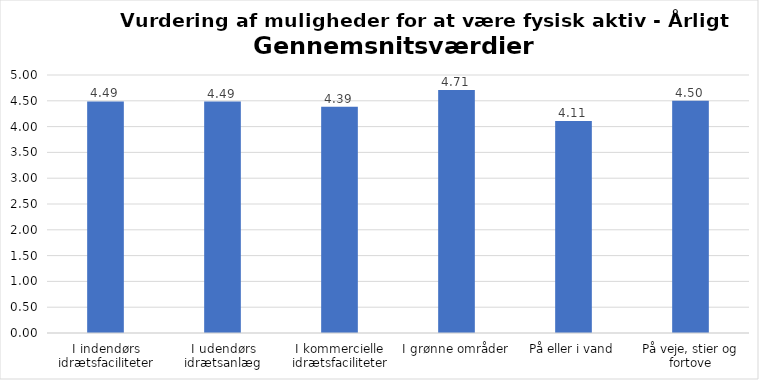
| Category | Gennemsnit |
|---|---|
| I indendørs idrætsfaciliteter | 4.487 |
| I udendørs idrætsanlæg | 4.485 |
| I kommercielle idrætsfaciliteter | 4.386 |
| I grønne områder | 4.711 |
| På eller i vand | 4.111 |
| På veje, stier og fortove | 4.503 |